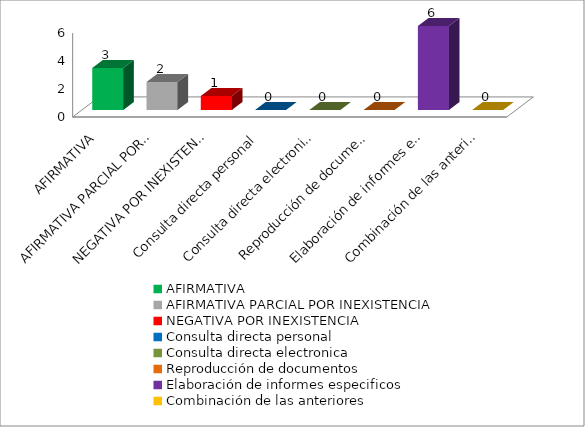
| Category | Series 3 |
|---|---|
| AFIRMATIVA | 3 |
| AFIRMATIVA PARCIAL POR INEXISTENCIA | 2 |
| NEGATIVA POR INEXISTENCIA | 1 |
| Consulta directa personal | 0 |
| Consulta directa electronica | 0 |
| Reproducción de documentos | 0 |
| Elaboración de informes especificos | 6 |
| Combinación de las anteriores | 0 |